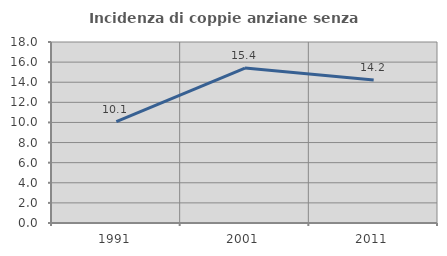
| Category | Incidenza di coppie anziane senza figli  |
|---|---|
| 1991.0 | 10.075 |
| 2001.0 | 15.411 |
| 2011.0 | 14.228 |